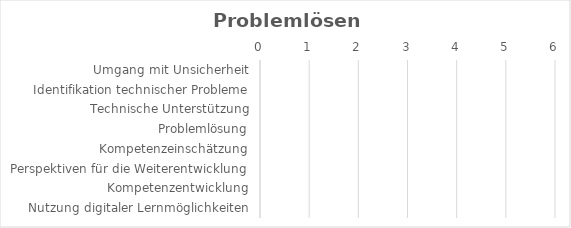
| Category | Problemlösen und Weiterlernen |
|---|---|
| Umgang mit Unsicherheit | 0 |
| Identifikation technischer Probleme | 0 |
| Technische Unterstützung | 0 |
| Problemlösung | 0 |
| Kompetenzeinschätzung | 0 |
| Perspektiven für die Weiterentwicklung | 0 |
| Kompetenzentwicklung | 0 |
| Nutzung digitaler Lernmöglichkeiten | 0 |